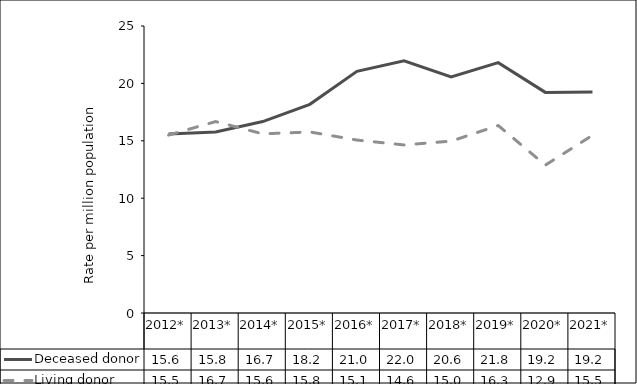
| Category | Deceased donor | Living donor |
|---|---|---|
| 2012* | 15.584 | 15.498 |
| 2013* | 15.763 | 16.675 |
| 2014* | 16.677 | 15.605 |
| 2015* | 18.178 | 15.769 |
| 2016* | 21.047 | 15.065 |
| 2017* | 21.973 | 14.639 |
| 2018* | 20.558 | 14.974 |
| 2019* | 21.808 | 16.329 |
| 2020* | 19.218 | 12.882 |
| 2021* | 19.244 | 15.479 |